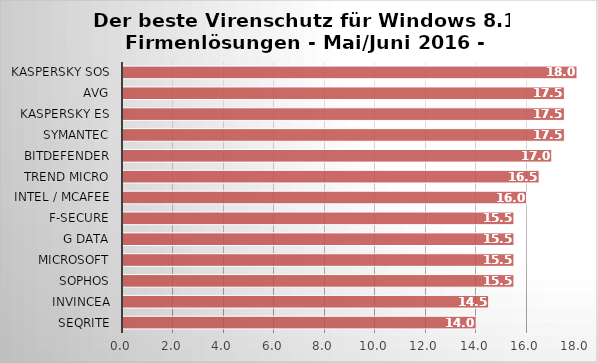
| Category | Series 0 |
|---|---|
| Seqrite | 14 |
| Invincea | 14.5 |
| Sophos | 15.5 |
| Microsoft | 15.5 |
| G Data | 15.5 |
| F-Secure | 15.5 |
| Intel / McAfee | 16 |
| Trend Micro | 16.5 |
| Bitdefender | 17 |
| Symantec | 17.5 |
| Kaspersky ES | 17.5 |
| AVG | 17.5 |
| Kaspersky SOS | 18 |